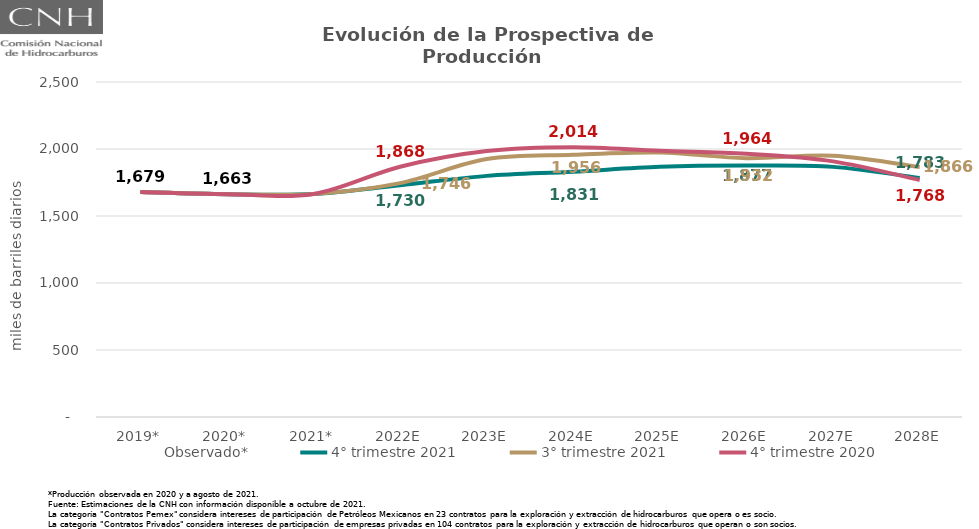
| Category | Observado* | 4° trimestre 2021 | 3° trimestre 2021 | 4° trimestre 2020 |
|---|---|---|---|---|
| 2019* | 1678.832 | 1678.832 | 1678.832 | 1678.832 |
| 2020* | 1663.043 | 1663.043 | 1663.043 | 1663.043 |
| 2021* | 1664.708 | 1664.708 | 1664.708 | 1664.708 |
| 2022E | 1729.81 | 1729.81 | 1745.525 | 1867.88 |
| 2023E | 1799.458 | 1799.458 | 1924.769 | 1984.685 |
| 2024E | 1830.777 | 1830.777 | 1956.201 | 2013.718 |
| 2025E | 1867.354 | 1867.354 | 1973.022 | 1986.38 |
| 2026E | 1876.537 | 1876.537 | 1931.653 | 1964.293 |
| 2027E | 1866.595 | 1866.595 | 1950.433 | 1907.684 |
| 2028E | 1783.438 | 1783.438 | 1866.164 | 1768.315 |